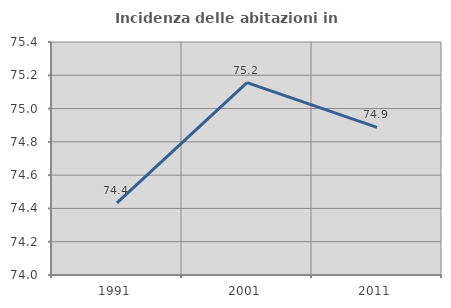
| Category | Incidenza delle abitazioni in proprietà  |
|---|---|
| 1991.0 | 74.434 |
| 2001.0 | 75.156 |
| 2011.0 | 74.887 |